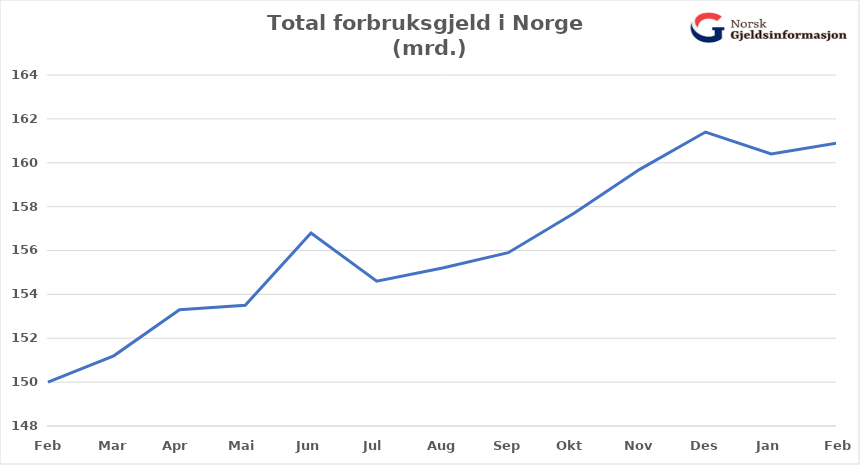
| Category | Total usikret gjeld (mrd) |
|---|---|
| Feb | 150 |
| Mar | 151.2 |
| Apr | 153.3 |
| Mai | 153.5 |
| Jun | 156.8 |
| Jul | 154.6 |
| Aug | 155.2 |
| Sep | 155.9 |
| Okt | 157.7 |
| Nov | 159.7 |
| Des | 161.4 |
| Jan | 160.4 |
| Feb | 160.9 |